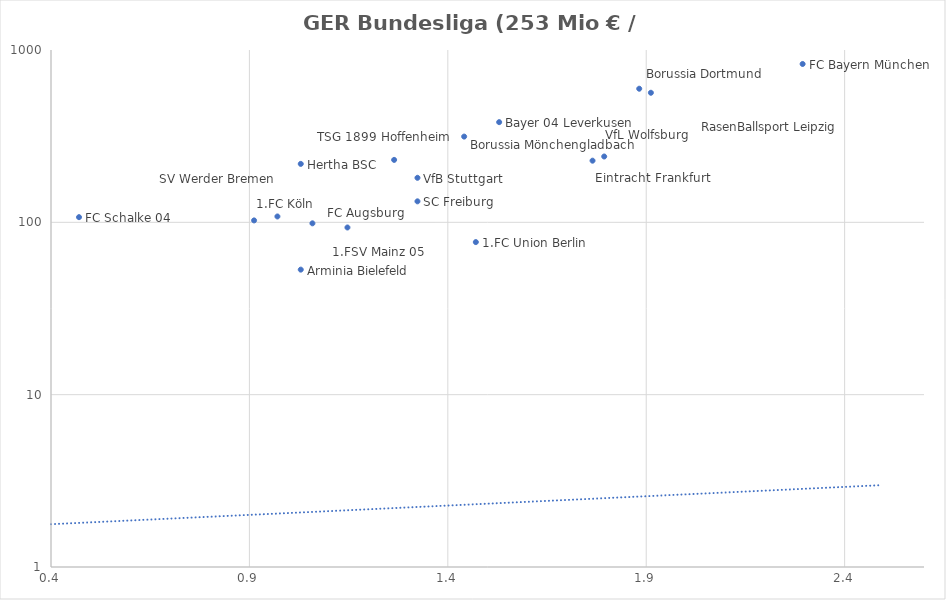
| Category | Series 0 |
|---|---|
| 2.2941176470588234 | 829.6 |
| 1.911764705882353 | 564.78 |
| 1.8823529411764706 | 596.1 |
| 1.7941176470588236 | 241 |
| 1.7647058823529411 | 227.9 |
| 1.5294117647058822 | 381.4 |
| 1.4705882352941178 | 76.8 |
| 1.4411764705882353 | 314.45 |
| 1.3235294117647058 | 181.3 |
| 1.3235294117647058 | 132.38 |
| 1.2647058823529411 | 230.3 |
| 1.1470588235294117 | 93.35 |
| 1.0588235294117647 | 98.68 |
| 1.0294117647058822 | 218.33 |
| 1.0294117647058822 | 53.15 |
| 0.9705882352941176 | 108.15 |
| 0.9117647058823529 | 102.6 |
| 0.47058823529411764 | 107.15 |